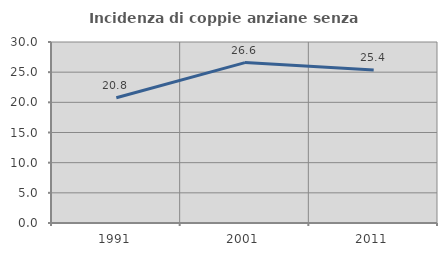
| Category | Incidenza di coppie anziane senza figli  |
|---|---|
| 1991.0 | 20.755 |
| 2001.0 | 26.582 |
| 2011.0 | 25.362 |